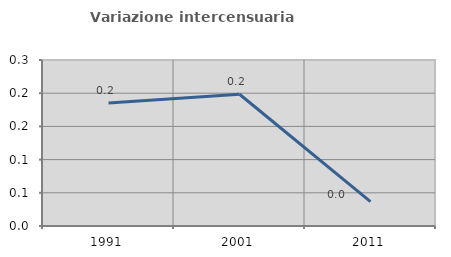
| Category | Variazione intercensuaria annua |
|---|---|
| 1991.0 | 0.185 |
| 2001.0 | 0.198 |
| 2011.0 | 0.037 |